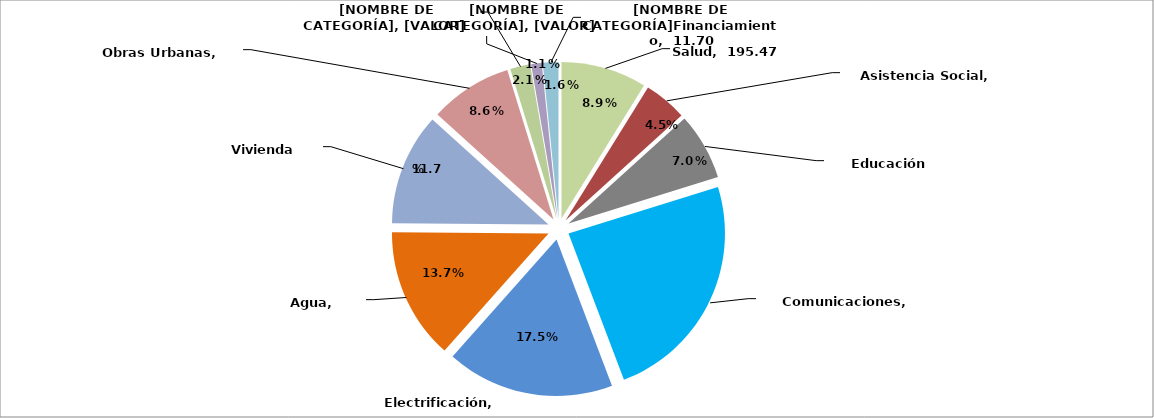
| Category | Series 0 |
|---|---|
| Salud | 195.472 |
| Asistencia Social | 98.354 |
| Educación | 152.92 |
| Comunicaciones | 531.618 |
| Electrificación | 383.363 |
| Agua | 300.012 |
| Vivienda | 255.944 |
| Obras Urbanas | 188.596 |
| Deporte | 45.92 |
| Cultura | 23.99 |